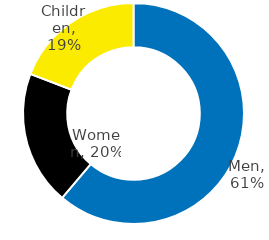
| Category | Series 0 |
|---|---|
| Men | 0.612 |
| Women | 0.197 |
| Children | 0.192 |